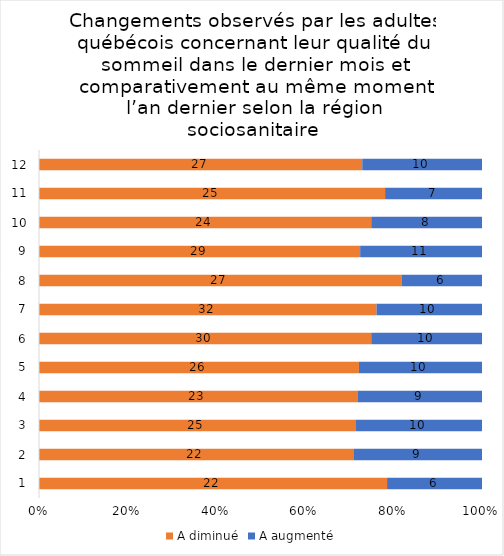
| Category | A diminué | A augmenté |
|---|---|---|
| 0 | 22 | 6 |
| 1 | 22 | 9 |
| 2 | 25 | 10 |
| 3 | 23 | 9 |
| 4 | 26 | 10 |
| 5 | 30 | 10 |
| 6 | 32 | 10 |
| 7 | 27 | 6 |
| 8 | 29 | 11 |
| 9 | 24 | 8 |
| 10 | 25 | 7 |
| 11 | 27 | 10 |